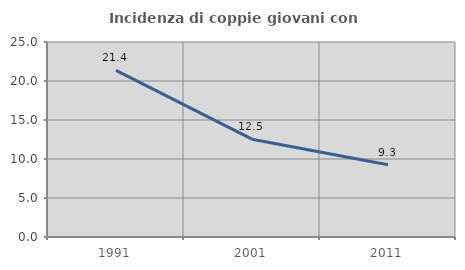
| Category | Incidenza di coppie giovani con figli |
|---|---|
| 1991.0 | 21.368 |
| 2001.0 | 12.544 |
| 2011.0 | 9.259 |